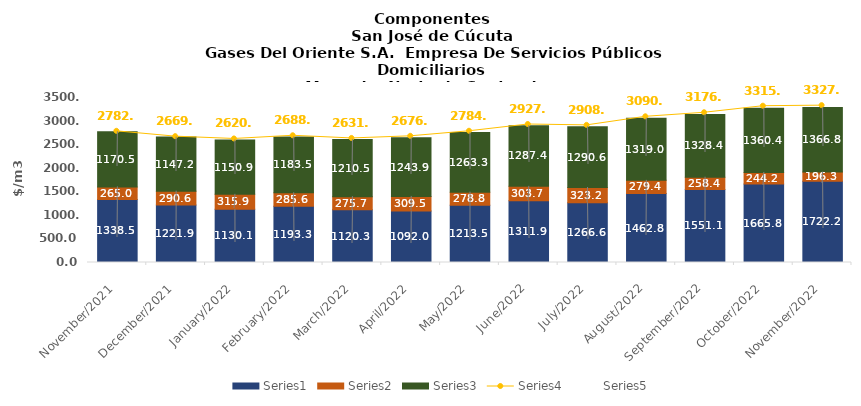
| Category | Series 0 | Series 1 | Series 2 |
|---|---|---|---|
| 2021-11-01 | 1338.51 | 265.04 | 1170.48 |
| 2021-12-01 | 1221.86 | 290.55 | 1147.22 |
| 2022-01-01 | 1130.08 | 315.87 | 1150.94 |
| 2022-02-01 | 1193.32 | 285.55 | 1183.5 |
| 2022-03-01 | 1120.29 | 275.73 | 1210.53 |
| 2022-04-01 | 1092 | 309.51 | 1243.93 |
| 2022-05-01 | 1213.53 | 278.75 | 1263.34 |
| 2022-06-01 | 1311.85 | 303.7 | 1287.39 |
| 2022-07-01 | 1266.62 | 323.18 | 1290.61 |
| 2022-08-01 | 1462.83 | 279.37 | 1319 |
| 2022-09-01 | 1551.06 | 258.41 | 1328.42 |
| 2022-10-01 | 1665.75 | 244.23 | 1360.41 |
| 2022-11-01 | 1722.18 | 196.33 | 1366.84 |